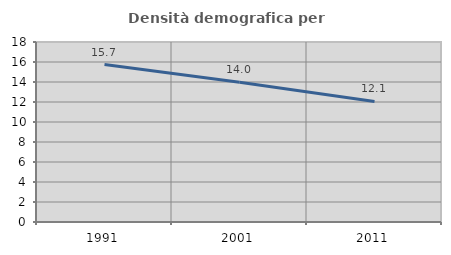
| Category | Densità demografica |
|---|---|
| 1991.0 | 15.745 |
| 2001.0 | 13.965 |
| 2011.0 | 12.052 |